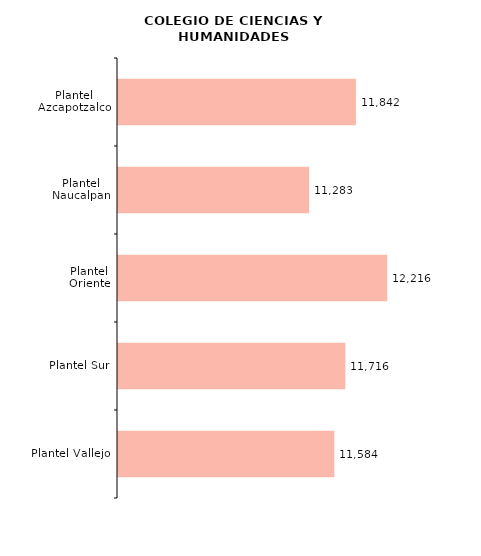
| Category | Series 0 |
|---|---|
| Plantel Vallejo | 11584 |
| Plantel Sur | 11716 |
| Plantel Oriente | 12216 |
| Plantel Naucalpan | 11283 |
| Plantel Azcapotzalco | 11842 |